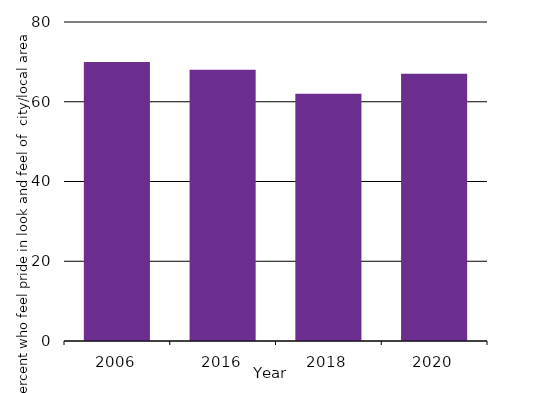
| Category | Percent who feel pride in look and feel of city/local area |
|---|---|
| 2006.0 | 70 |
| 2016.0 | 68 |
| 2018.0 | 62 |
| 2020.0 | 67 |